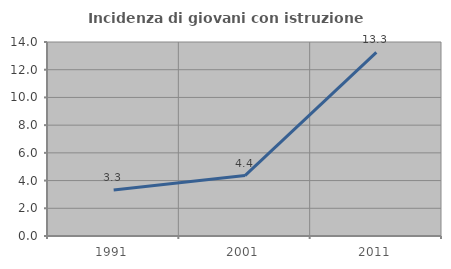
| Category | Incidenza di giovani con istruzione universitaria |
|---|---|
| 1991.0 | 3.315 |
| 2001.0 | 4.36 |
| 2011.0 | 13.251 |